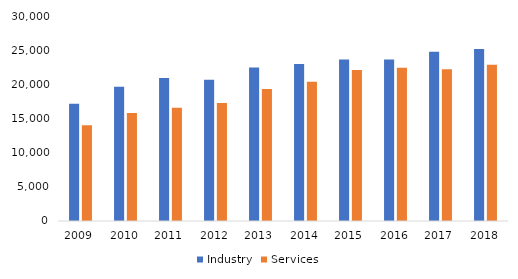
| Category | Industry | Services |
|---|---|---|
| 2009.0 | 17165 | 14008 |
| 2010.0 | 19644 | 15804 |
| 2011.0 | 20944 | 16583 |
| 2012.0 | 20682 | 17253 |
| 2013.0 | 22479 | 19332 |
| 2014.0 | 22973 | 20389 |
| 2015.0 | 23632 | 22090 |
| 2016.0 | 23648 | 22439 |
| 2017.0 | 24785 | 22215 |
| 2018.0 | 25173 | 22876 |